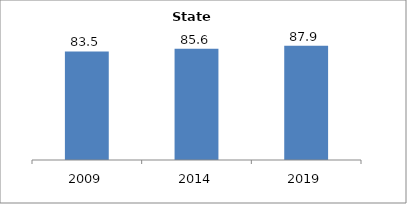
| Category | Series 0 |
|---|---|
| 2009.0 | 83.465 |
| 2014.0 | 85.647 |
| 2019.0 | 87.91 |